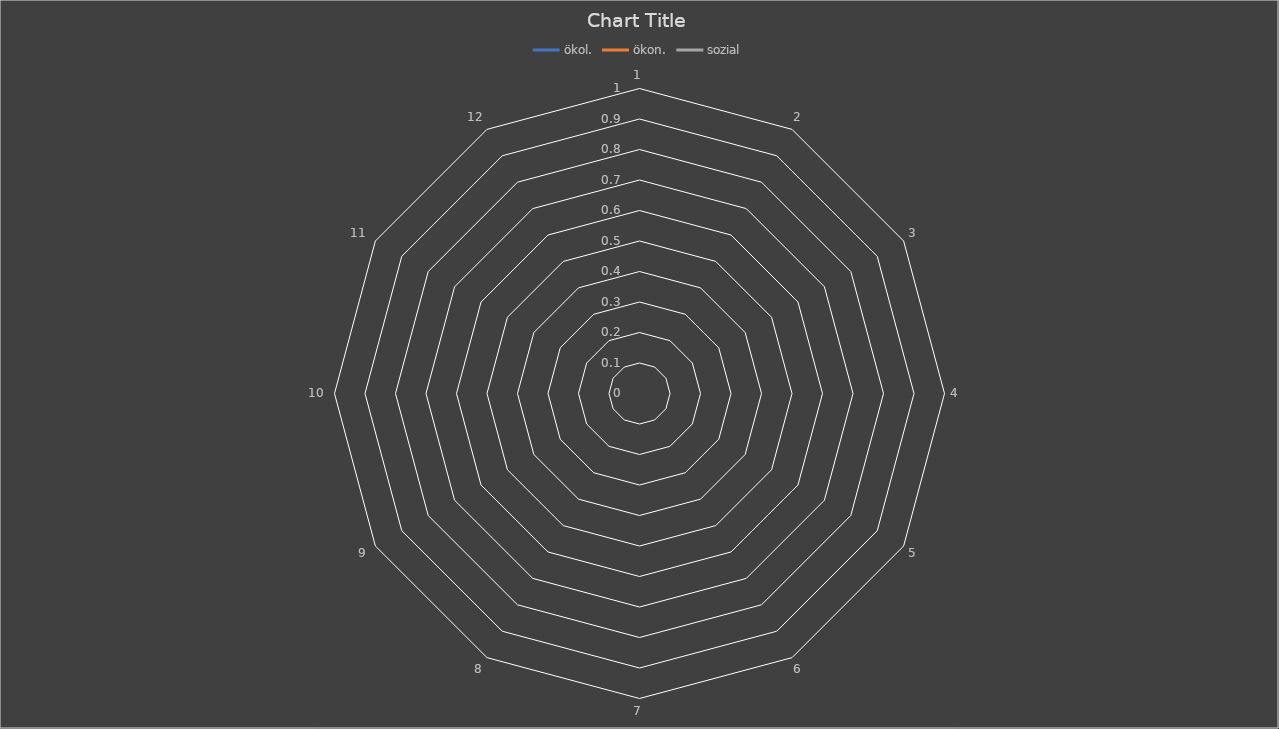
| Category | ökol. | ökon. | sozial |
|---|---|---|---|
| 0 | 0 | 0 | 0 |
| 1 | 0 | 0 | 0 |
| 2 | 0 | 0 | 0 |
| 3 | 0 | 0 | 0 |
| 4 | 0 | 0 | 0 |
| 5 | 0 | 0 | 0 |
| 6 | 0 | 0 | 0 |
| 7 | 0 | 0 | 0 |
| 8 | 0 | 0 | 0 |
| 9 | 0 | 0 | 0 |
| 10 | 0 | 0 | 0 |
| 11 | 0 | 0 | 0 |